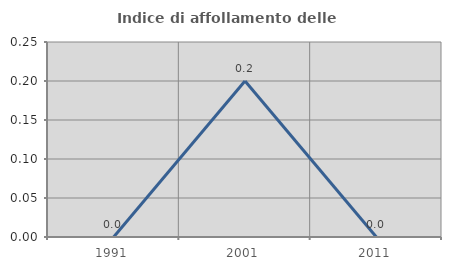
| Category | Indice di affollamento delle abitazioni  |
|---|---|
| 1991.0 | 0 |
| 2001.0 | 0.2 |
| 2011.0 | 0 |